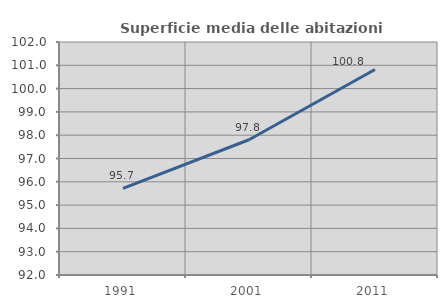
| Category | Superficie media delle abitazioni occupate |
|---|---|
| 1991.0 | 95.721 |
| 2001.0 | 97.804 |
| 2011.0 | 100.821 |